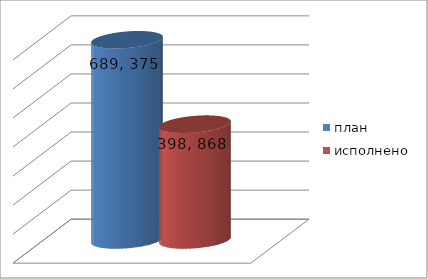
| Category | план | исполнено |
|---|---|---|
| 0 | 689375136.66 | 398868127.25 |